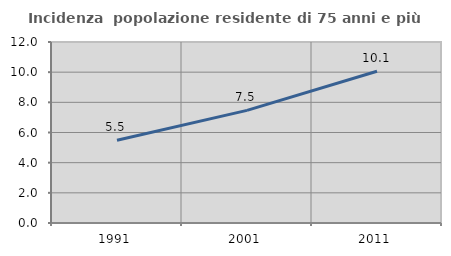
| Category | Incidenza  popolazione residente di 75 anni e più |
|---|---|
| 1991.0 | 5.488 |
| 2001.0 | 7.466 |
| 2011.0 | 10.063 |